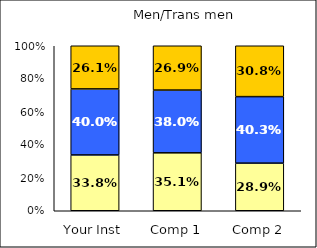
| Category | Low Pluralistic Orientation | Average Pluralistic Orientation | High Pluralistic Orientation |
|---|---|---|---|
| Your Inst | 0.338 | 0.4 | 0.261 |
| Comp 1 | 0.351 | 0.38 | 0.269 |
| Comp 2 | 0.289 | 0.403 | 0.308 |